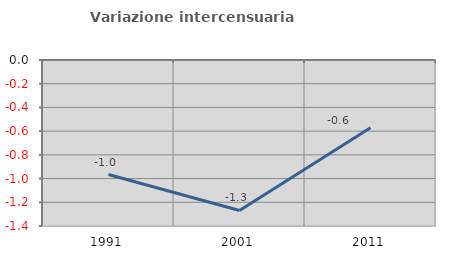
| Category | Variazione intercensuaria annua |
|---|---|
| 1991.0 | -0.966 |
| 2001.0 | -1.269 |
| 2011.0 | -0.57 |